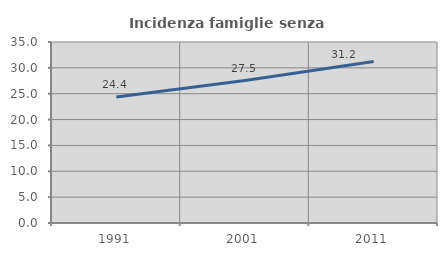
| Category | Incidenza famiglie senza nuclei |
|---|---|
| 1991.0 | 24.353 |
| 2001.0 | 27.534 |
| 2011.0 | 31.228 |